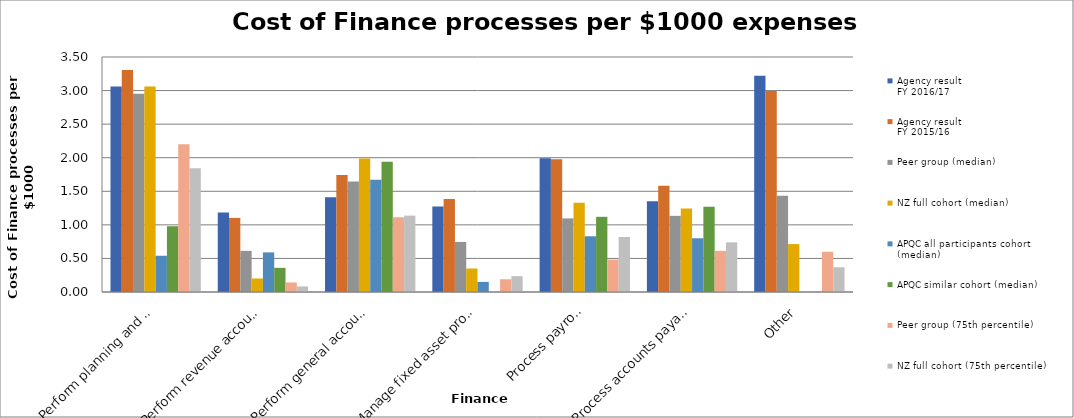
| Category | Agency result
FY 2016/17 | Agency result
FY 2015/16 | Peer group (median) | NZ full cohort (median) | APQC all participants cohort (median) | APQC similar cohort (median) | Peer group (75th percentile) | NZ full cohort (75th percentile) |
|---|---|---|---|---|---|---|---|---|
| Perform planning and management accounting | 3.06 | 3.305 | 2.952 | 3.061 | 0.54 | 0.98 | 2.199 | 1.844 |
| Perform revenue accounting | 1.185 | 1.104 | 0.613 | 0.202 | 0.59 | 0.36 | 0.142 | 0.083 |
| Perform general accounting and reporting | 1.41 | 1.744 | 1.644 | 1.988 | 1.67 | 1.94 | 1.113 | 1.138 |
| Manage fixed asset project accounting | 1.275 | 1.386 | 0.745 | 0.35 | 0.15 | 0 | 0.19 | 0.236 |
| Process payroll | 1.994 | 1.976 | 1.096 | 1.328 | 0.83 | 1.12 | 0.484 | 0.82 |
| Process accounts payable and expense reimbursements | 1.352 | 1.584 | 1.134 | 1.243 | 0.8 | 1.27 | 0.613 | 0.74 |
| Other | 3.22 | 2.994 | 1.434 | 0.714 | 0 | 0 | 0.599 | 0.368 |